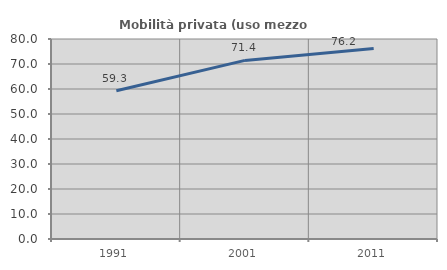
| Category | Mobilità privata (uso mezzo privato) |
|---|---|
| 1991.0 | 59.31 |
| 2001.0 | 71.439 |
| 2011.0 | 76.163 |